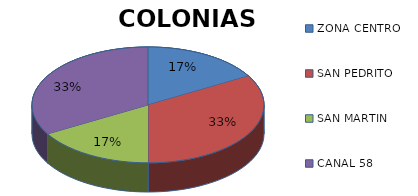
| Category | COLONIA |
|---|---|
| ZONA CENTRO | 1 |
| SAN PEDRITO | 2 |
| SAN MARTIN | 1 |
| CANAL 58 | 2 |